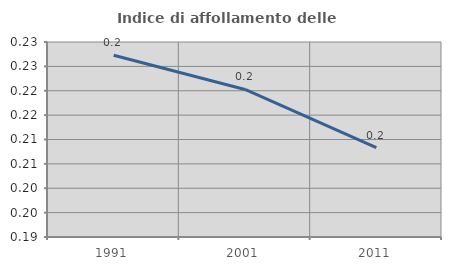
| Category | Indice di affollamento delle abitazioni  |
|---|---|
| 1991.0 | 0.227 |
| 2001.0 | 0.22 |
| 2011.0 | 0.208 |